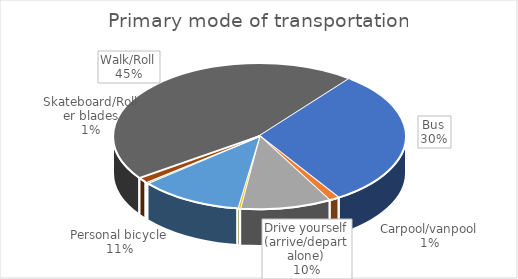
| Category | Series 0 |
|---|---|
| Bus | 106 |
| Carpool/vanpool | 4 |
| Drive yourself (arrive/depart alone) | 35 |
| Get a ride (dropped off by someone who goes off-campus) | 1 |
| Personal bicycle | 40 |
| Ride share (Uber/Lyft) | 1 |
| Scooter | 0 |
| Skateboard/Roller blades | 4 |
| Walk/Roll | 158 |